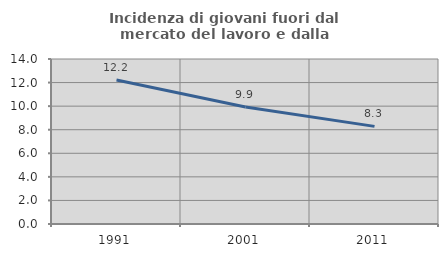
| Category | Incidenza di giovani fuori dal mercato del lavoro e dalla formazione  |
|---|---|
| 1991.0 | 12.211 |
| 2001.0 | 9.926 |
| 2011.0 | 8.282 |